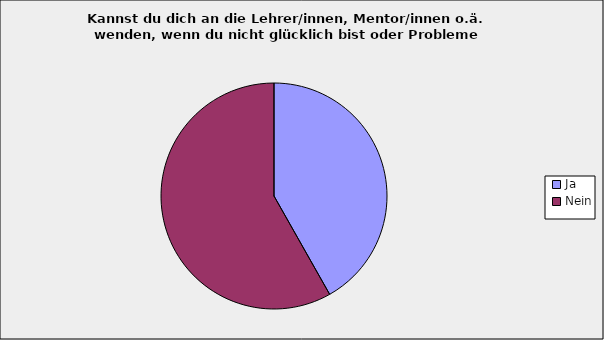
| Category | Series 0 |
|---|---|
| Ja | 0.418 |
| Nein | 0.582 |